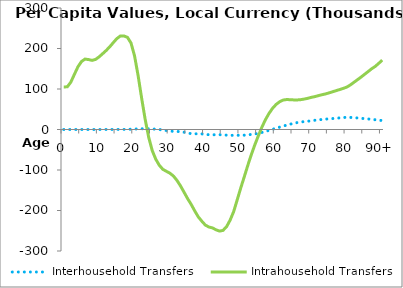
| Category | Interhousehold Transfers | Intrahousehold Transfers |
|---|---|---|
| 0 | 0 | 105003.573 |
|  | 0 | 105429.066 |
| 2 | 0 | 117030.174 |
| 3 | 0 | 136132 |
| 4 | 0 | 154718.36 |
| 5 | 0 | 167739.399 |
| 6 | 0 | 173893.085 |
| 7 | 0 | 172676.641 |
| 8 | 0 | 170700.926 |
| 9 | 0 | 173089.273 |
| 10 | 0 | 179456.863 |
| 11 | 1.079 | 187272.471 |
| 12 | 23.108 | 195211.025 |
| 13 | 80.651 | 204291.922 |
| 14 | 138.745 | 214570.099 |
| 15 | 205.262 | 224464.118 |
| 16 | 254.63 | 231015.048 |
| 17 | 256.313 | 230966.261 |
| 18 | 408.029 | 227541.456 |
| 19 | 775.244 | 213612.444 |
| 20 | 1096.455 | 181982.859 |
| 21 | 1533.901 | 133609.367 |
| 22 | 1758.758 | 77794.759 |
| 23 | 1885.064 | 25231.206 |
| 24 | 1844.938 | -19278.588 |
| 25 | 1356.426 | -52071.833 |
| 26 | 699.756 | -73299.596 |
| 27 | -10.043 | -88366.661 |
| 28 | -1268.064 | -98314.757 |
| 29 | -2641.403 | -103217.735 |
| 30 | -3634.65 | -107910.998 |
| 31 | -4749.636 | -114971.327 |
| 32 | -4943.876 | -125784.151 |
| 33 | -5235.296 | -139388.289 |
| 34 | -6773.051 | -154940.567 |
| 35 | -8706.931 | -170699.398 |
| 36 | -10277.306 | -184841.827 |
| 37 | -10820.262 | -200754.151 |
| 38 | -10390.222 | -215580.405 |
| 39 | -10841.519 | -226249.321 |
| 40 | -12226.67 | -235920.737 |
| 41 | -12770.54 | -240694.294 |
| 42 | -13183.277 | -242958.361 |
| 43 | -12853.282 | -247508.772 |
| 44 | -12798.069 | -250821.407 |
| 45 | -13194.678 | -249144.147 |
| 46 | -13946.978 | -240154.19 |
| 47 | -14388.854 | -223978.829 |
| 48 | -14406.517 | -203136.819 |
| 49 | -14336.789 | -174115.501 |
| 50 | -14252.462 | -144822.32 |
| 51 | -13922.468 | -117133.3 |
| 52 | -13021.754 | -88841.449 |
| 53 | -12199.309 | -62227.254 |
| 54 | -11085.132 | -37670.308 |
| 55 | -9322.302 | -15391.083 |
| 56 | -7263.994 | 5968.684 |
| 57 | -4788.856 | 24341.694 |
| 58 | -2084.902 | 39621.293 |
| 59 | 597.573 | 52258.511 |
| 60 | 3156.927 | 61790.47 |
| 61 | 5765.398 | 68482.586 |
| 62 | 8356.02 | 72671.495 |
| 63 | 10831.179 | 74009.143 |
| 64 | 13243.344 | 73561.39 |
| 65 | 15383.856 | 73069.359 |
| 66 | 17151.151 | 72987.776 |
| 67 | 18564.829 | 73713.436 |
| 68 | 19544.975 | 75167.914 |
| 69 | 20452.619 | 77090.775 |
| 70 | 21509.599 | 79481.096 |
| 71 | 22864.264 | 81288.841 |
| 72 | 23886.171 | 83698.04 |
| 73 | 24720.005 | 85921.76 |
| 74 | 25618.824 | 87881.129 |
| 75 | 26369.69 | 90483.827 |
| 76 | 27024.961 | 93222.895 |
| 77 | 27797.341 | 95984.418 |
| 78 | 28668.534 | 98720.648 |
| 79 | 29518.435 | 101572.402 |
| 80 | 30160.695 | 104708.6 |
| 81 | 29848.603 | 110094.022 |
| 82 | 29194.791 | 116477.365 |
| 83 | 28527.996 | 122849.566 |
| 84 | 27693.11 | 129317.678 |
| 85 | 26836.407 | 136126.964 |
| 86 | 25970.468 | 142962.834 |
| 87 | 25080.158 | 149877.748 |
| 88 | 24155.611 | 155650.103 |
| 89 | 23195.632 | 163214.359 |
| 90+ | 22026.69 | 171451.58 |